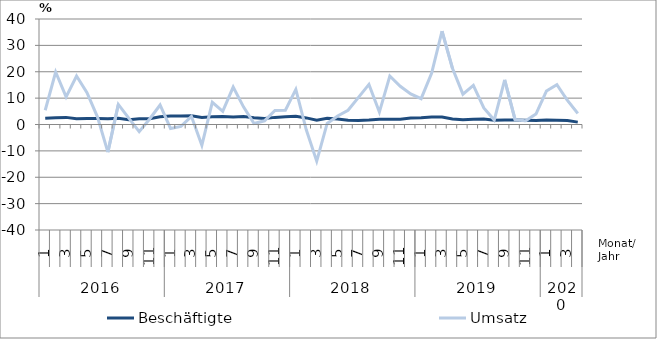
| Category | Beschäftigte | Umsatz |
|---|---|---|
| 0 | 2.4 | 5.4 |
| 1 | 2.6 | 19.9 |
| 2 | 2.7 | 10.5 |
| 3 | 2.2 | 18.4 |
| 4 | 2.3 | 12.1 |
| 5 | 2.3 | 2.9 |
| 6 | 2.2 | -10.5 |
| 7 | 2.4 | 7.6 |
| 8 | 1.8 | 2.4 |
| 9 | 2.2 | -2.7 |
| 10 | 2.2 | 2.1 |
| 11 | 2.9 | 7.4 |
| 12 | 3.2 | -1.5 |
| 13 | 3.2 | -0.7 |
| 14 | 3.3 | 3.1 |
| 15 | 2.7 | -7.9 |
| 16 | 2.9 | 8.4 |
| 17 | 3 | 5 |
| 18 | 2.8 | 14.2 |
| 19 | 3 | 6.6 |
| 20 | 2.6 | 0.4 |
| 21 | 2.3 | 1.4 |
| 22 | 2.7 | 5.3 |
| 23 | 2.9 | 5.4 |
| 24 | 3.1 | 13.3 |
| 25 | 2.5 | -2 |
| 26 | 1.6 | -13.9 |
| 27 | 2.4 | 0.4 |
| 28 | 2.1 | 3.2 |
| 29 | 1.6 | 5.4 |
| 30 | 1.5 | 10.3 |
| 31 | 1.7 | 15.2 |
| 32 | 2 | 4.7 |
| 33 | 2 | 18.4 |
| 34 | 2 | 14.5 |
| 35 | 2.5 | 11.6 |
| 36 | 2.6 | 9.8 |
| 37 | 2.8 | 19.4 |
| 38 | 2.8 | 35.4 |
| 39 | 2.1 | 21.3 |
| 40 | 1.8 | 11.5 |
| 41 | 2 | 14.8 |
| 42 | 2.1 | 6.3 |
| 43 | 1.6 | 1.7 |
| 44 | 1.7 | 16.9 |
| 45 | 1.7 | 1.8 |
| 46 | 1.6 | 1.4 |
| 47 | 1.5 | 4 |
| 48 | 1.7 | 12.7 |
| 49 | 1.6 | 15.1 |
| 50 | 1.5 | 9.2 |
| 51 | 0.9 | 4.2 |